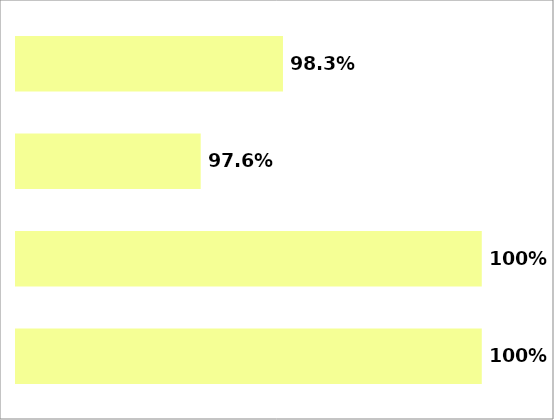
| Category | Series 0 |
|---|---|
| 0 | 0.983 |
| 1 | 0.976 |
| 2 | 1 |
| 3 | 1 |